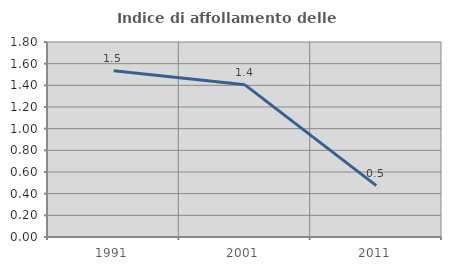
| Category | Indice di affollamento delle abitazioni  |
|---|---|
| 1991.0 | 1.534 |
| 2001.0 | 1.405 |
| 2011.0 | 0.474 |